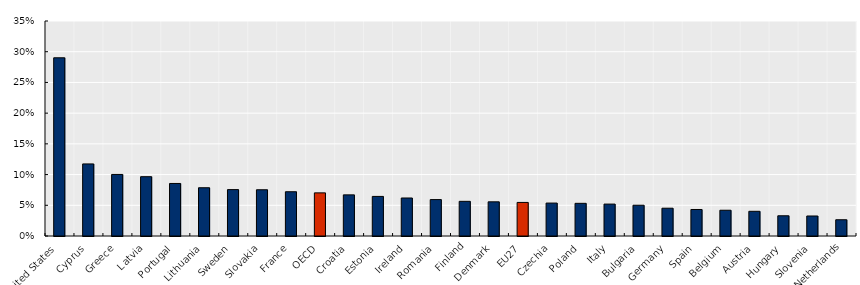
| Category | Share of respondents who responded "very likely" or "rather likely"  |
|---|---|
| United States | 0.29 |
| Cyprus | 0.117 |
| Greece | 0.1 |
| Latvia | 0.097 |
| Portugal | 0.086 |
| Lithuania | 0.079 |
| Sweden | 0.076 |
| Slovakia | 0.075 |
| France | 0.072 |
| OECD | 0.07 |
| Croatia | 0.067 |
| Estonia | 0.064 |
| Ireland | 0.062 |
| Romania | 0.059 |
| Finland | 0.056 |
| Denmark | 0.056 |
| EU27 | 0.055 |
| Czechia | 0.054 |
| Poland | 0.053 |
| Italy | 0.052 |
| Bulgaria | 0.05 |
| Germany | 0.045 |
| Spain | 0.043 |
| Belgium | 0.042 |
| Austria | 0.04 |
| Hungary | 0.033 |
| Slovenia | 0.033 |
| Netherlands | 0.026 |